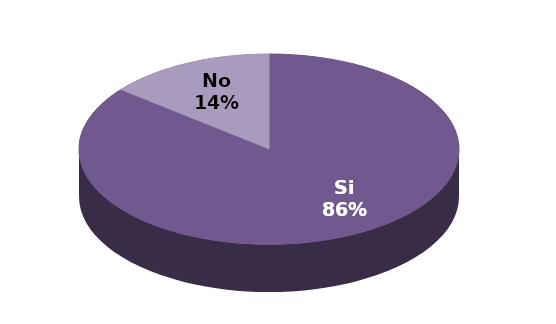
| Category | Series 1 |
|---|---|
| Si | 12 |
| No | 2 |